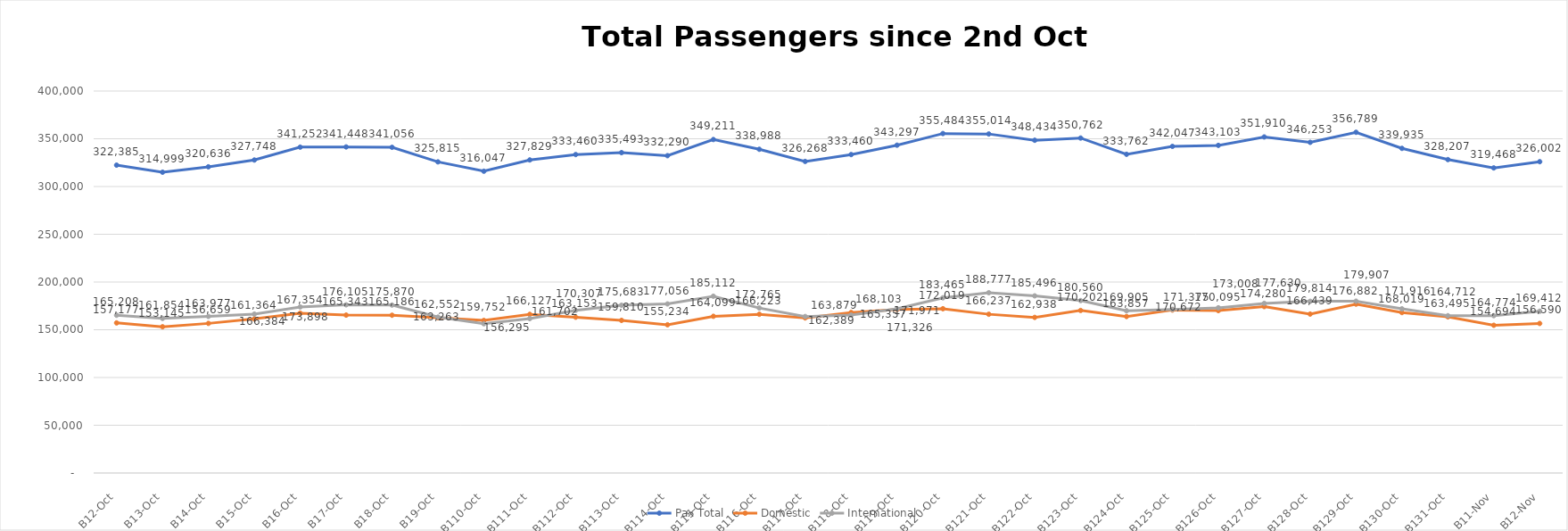
| Category | Pax Total | Domestic | International |
|---|---|---|---|
| 2023-10-02 | 322385 | 157177 | 165208 |
| 2023-10-03 | 314999 | 153145 | 161854 |
| 2023-10-04 | 320636 | 156659 | 163977 |
| 2023-10-05 | 327748 | 161364 | 166384 |
| 2023-10-06 | 341252 | 167354 | 173898 |
| 2023-10-07 | 341448 | 165343 | 176105 |
| 2023-10-08 | 341056 | 165186 | 175870 |
| 2023-10-09 | 325815 | 162552 | 163263 |
| 2023-10-10 | 316047 | 159752 | 156295 |
| 2023-10-11 | 327829 | 166127 | 161702 |
| 2023-10-12 | 333460 | 163153 | 170307 |
| 2023-10-13 | 335493 | 159810 | 175683 |
| 2023-10-14 | 332290 | 155234 | 177056 |
| 2023-10-15 | 349211 | 164099 | 185112 |
| 2023-10-16 | 338988 | 166223 | 172765 |
| 2023-10-17 | 326268 | 162389 | 163879 |
| 2023-10-18 | 333460 | 168103 | 165357 |
| 2023-10-19 | 343297 | 171326 | 171971 |
| 2023-10-20 | 355484 | 172019 | 183465 |
| 2023-10-21 | 355014 | 166237 | 188777 |
| 2023-10-22 | 348434 | 162938 | 185496 |
| 2023-10-23 | 350762 | 170202 | 180560 |
| 2023-10-24 | 333762 | 163857 | 169905 |
| 2023-10-25 | 342047 | 170672 | 171375 |
| 2023-10-26 | 343103 | 170095 | 173008 |
| 2023-10-27 | 351910 | 174280 | 177630 |
| 2023-10-28 | 346253 | 166439 | 179814 |
| 2023-10-29 | 356789 | 176882 | 179907 |
| 2023-10-30 | 339935 | 168019 | 171916 |
| 2023-10-31 | 328207 | 163495 | 164712 |
| 2023-11-01 | 319468 | 154694 | 164774 |
| 2023-11-02 | 326002 | 156590 | 169412 |